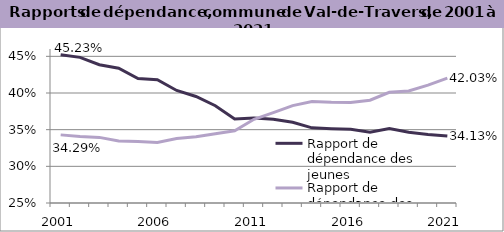
| Category | Rapport de dépendance des jeunes | Rapport de dépendance des personnes âgées |
|---|---|---|
| 2001.0 | 0.452 | 0.343 |
| 2002.0 | 0.449 | 0.341 |
| 2003.0 | 0.439 | 0.339 |
| 2004.0 | 0.434 | 0.335 |
| 2005.0 | 0.42 | 0.334 |
| 2006.0 | 0.418 | 0.332 |
| 2007.0 | 0.403 | 0.338 |
| 2008.0 | 0.395 | 0.34 |
| 2009.0 | 0.383 | 0.345 |
| 2010.0 | 0.365 | 0.348 |
| 2011.0 | 0.366 | 0.364 |
| 2012.0 | 0.364 | 0.373 |
| 2013.0 | 0.36 | 0.383 |
| 2014.0 | 0.352 | 0.388 |
| 2015.0 | 0.351 | 0.387 |
| 2016.0 | 0.35 | 0.387 |
| 2017.0 | 0.347 | 0.39 |
| 2018.0 | 0.352 | 0.401 |
| 2019.0 | 0.347 | 0.403 |
| 2020.0 | 0.344 | 0.411 |
| 2021.0 | 0.341 | 0.42 |